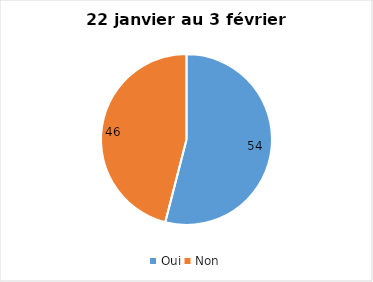
| Category | Series 0 |
|---|---|
| Oui | 54 |
| Non | 46 |